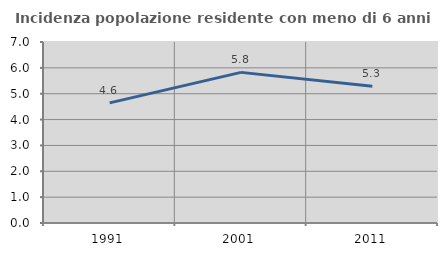
| Category | Incidenza popolazione residente con meno di 6 anni |
|---|---|
| 1991.0 | 4.645 |
| 2001.0 | 5.825 |
| 2011.0 | 5.288 |